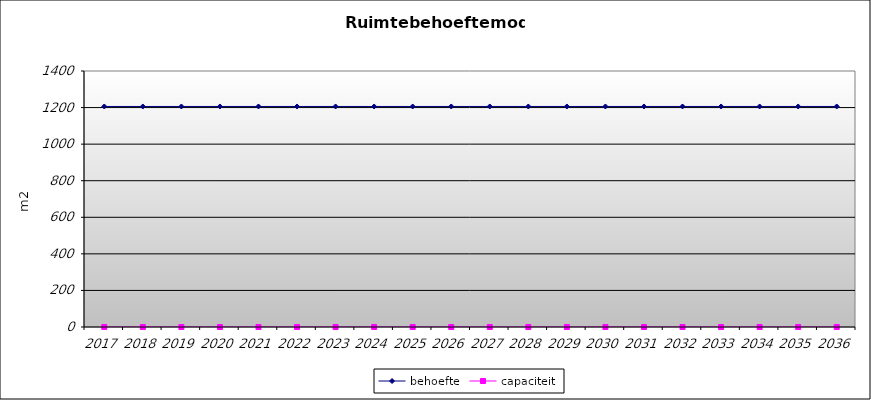
| Category | behoefte | capaciteit |
|---|---|---|
| 2017.0 | 1206 | 0 |
| 2018.0 | 1206 | 0 |
| 2019.0 | 1206 | 0 |
| 2020.0 | 1206 | 0 |
| 2021.0 | 1206 | 0 |
| 2022.0 | 1206 | 0 |
| 2023.0 | 1206 | 0 |
| 2024.0 | 1206 | 0 |
| 2025.0 | 1206 | 0 |
| 2026.0 | 1206 | 0 |
| 2027.0 | 1206 | 0 |
| 2028.0 | 1206 | 0 |
| 2029.0 | 1206 | 0 |
| 2030.0 | 1206 | 0 |
| 2031.0 | 1206 | 0 |
| 2032.0 | 1206 | 0 |
| 2033.0 | 1206 | 0 |
| 2034.0 | 1206 | 0 |
| 2035.0 | 1206 | 0 |
| 2036.0 | 1206 | 0 |